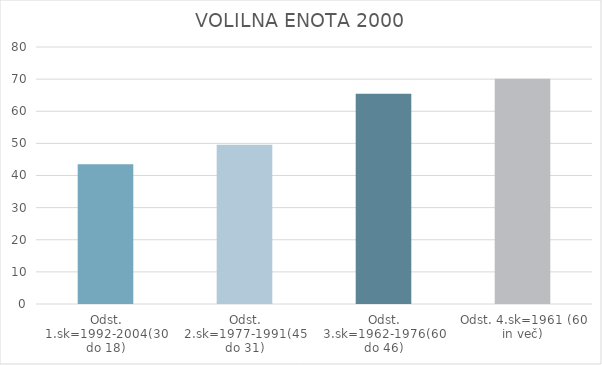
| Category | Series 0 |
|---|---|
| Odst. 1.sk=1992-2004(30 do 18) | 43.54 |
| Odst. 2.sk=1977-1991(45 do 31) | 49.54 |
| Odst. 3.sk=1962-1976(60 do 46) | 65.42 |
| Odst. 4.sk=1961 (60 in več) | 70.13 |